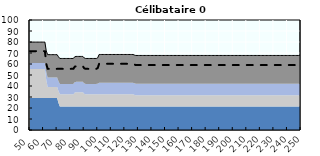
| Category | Coin fiscal marginal (somme des composantes) | Taux d’imposition marginal net |
|---|---|---|
| 50.0 | 79.927 | 71.687 |
| 51.0 | 79.927 | 71.687 |
| 52.0 | 79.927 | 71.687 |
| 53.0 | 79.927 | 71.687 |
| 54.0 | 79.927 | 71.687 |
| 55.0 | 79.927 | 71.687 |
| 56.0 | 79.927 | 71.687 |
| 57.0 | 79.927 | 71.687 |
| 58.0 | 79.927 | 71.687 |
| 59.0 | 79.927 | 71.687 |
| 60.0 | 79.927 | 71.687 |
| 61.0 | 79.927 | 71.687 |
| 62.0 | 71.871 | 60.325 |
| 63.0 | 68.504 | 55.575 |
| 64.0 | 68.504 | 55.575 |
| 65.0 | 68.504 | 55.575 |
| 66.0 | 68.504 | 55.575 |
| 67.0 | 68.504 | 55.575 |
| 68.0 | 68.504 | 55.575 |
| 69.0 | 68.504 | 55.575 |
| 70.0 | 68.504 | 55.575 |
| 71.0 | 66.593 | 55.575 |
| 72.0 | 65.033 | 55.575 |
| 73.0 | 65.033 | 55.575 |
| 74.0 | 65.033 | 55.575 |
| 75.0 | 65.033 | 55.575 |
| 76.0 | 65.033 | 55.575 |
| 77.0 | 65.033 | 55.575 |
| 78.0 | 65.033 | 55.575 |
| 79.0 | 65.033 | 55.575 |
| 80.0 | 65.033 | 55.575 |
| 81.0 | 65.033 | 55.575 |
| 82.0 | 65.033 | 55.575 |
| 83.0 | 66.568 | 57.526 |
| 84.0 | 66.887 | 57.93 |
| 85.0 | 66.887 | 57.93 |
| 86.0 | 66.887 | 57.93 |
| 87.0 | 66.887 | 57.93 |
| 88.0 | 66.887 | 57.93 |
| 89.0 | 66.887 | 57.93 |
| 90.0 | 65.516 | 56.188 |
| 91.0 | 65.033 | 55.575 |
| 92.0 | 65.033 | 55.575 |
| 93.0 | 65.033 | 55.575 |
| 94.0 | 65.033 | 55.575 |
| 95.0 | 65.033 | 55.575 |
| 96.0 | 65.033 | 55.575 |
| 97.0 | 65.033 | 55.575 |
| 98.0 | 65.033 | 55.575 |
| 99.0 | 65.033 | 55.575 |
| 100.0 | 65.679 | 56.396 |
| 101.0 | 68.651 | 60.172 |
| 102.0 | 68.651 | 60.172 |
| 103.0 | 68.651 | 60.172 |
| 104.0 | 68.651 | 60.172 |
| 105.0 | 68.651 | 60.172 |
| 106.0 | 68.651 | 60.172 |
| 107.0 | 68.651 | 60.172 |
| 108.0 | 68.651 | 60.172 |
| 109.0 | 68.651 | 60.172 |
| 110.0 | 68.651 | 60.172 |
| 111.0 | 68.651 | 60.172 |
| 112.0 | 68.651 | 60.172 |
| 113.0 | 68.651 | 60.172 |
| 114.0 | 68.651 | 60.172 |
| 115.0 | 68.651 | 60.172 |
| 116.0 | 68.651 | 60.172 |
| 117.0 | 68.651 | 60.172 |
| 118.0 | 68.651 | 60.172 |
| 119.0 | 68.651 | 60.172 |
| 120.0 | 68.651 | 60.172 |
| 121.0 | 68.651 | 60.172 |
| 122.0 | 68.651 | 60.172 |
| 123.0 | 68.651 | 60.172 |
| 124.0 | 68.651 | 60.172 |
| 125.0 | 68.651 | 60.172 |
| 126.0 | 68.651 | 60.172 |
| 127.0 | 68.159 | 59.547 |
| 128.0 | 67.762 | 59.042 |
| 129.0 | 67.762 | 59.042 |
| 130.0 | 67.762 | 59.042 |
| 131.0 | 67.762 | 59.042 |
| 132.0 | 67.762 | 59.042 |
| 133.0 | 67.762 | 59.042 |
| 134.0 | 67.762 | 59.042 |
| 135.0 | 67.762 | 59.042 |
| 136.0 | 67.762 | 59.042 |
| 137.0 | 67.762 | 59.042 |
| 138.0 | 67.762 | 59.042 |
| 139.0 | 67.762 | 59.042 |
| 140.0 | 67.762 | 59.042 |
| 141.0 | 67.762 | 59.042 |
| 142.0 | 67.762 | 59.042 |
| 143.0 | 67.762 | 59.042 |
| 144.0 | 67.762 | 59.042 |
| 145.0 | 67.762 | 59.042 |
| 146.0 | 67.762 | 59.042 |
| 147.0 | 67.762 | 59.042 |
| 148.0 | 67.762 | 59.042 |
| 149.0 | 67.762 | 59.042 |
| 150.0 | 67.762 | 59.042 |
| 151.0 | 67.762 | 59.042 |
| 152.0 | 67.762 | 59.042 |
| 153.0 | 67.762 | 59.042 |
| 154.0 | 67.762 | 59.042 |
| 155.0 | 67.762 | 59.042 |
| 156.0 | 67.762 | 59.042 |
| 157.0 | 67.762 | 59.042 |
| 158.0 | 67.762 | 59.042 |
| 159.0 | 67.762 | 59.042 |
| 160.0 | 67.762 | 59.042 |
| 161.0 | 67.762 | 59.042 |
| 162.0 | 67.762 | 59.042 |
| 163.0 | 67.762 | 59.042 |
| 164.0 | 67.762 | 59.042 |
| 165.0 | 67.762 | 59.042 |
| 166.0 | 67.762 | 59.042 |
| 167.0 | 67.762 | 59.042 |
| 168.0 | 67.762 | 59.042 |
| 169.0 | 67.762 | 59.042 |
| 170.0 | 67.762 | 59.042 |
| 171.0 | 67.762 | 59.042 |
| 172.0 | 67.762 | 59.042 |
| 173.0 | 67.762 | 59.042 |
| 174.0 | 67.762 | 59.042 |
| 175.0 | 67.762 | 59.042 |
| 176.0 | 67.762 | 59.042 |
| 177.0 | 67.762 | 59.042 |
| 178.0 | 67.762 | 59.042 |
| 179.0 | 67.762 | 59.042 |
| 180.0 | 67.762 | 59.042 |
| 181.0 | 67.762 | 59.042 |
| 182.0 | 67.762 | 59.042 |
| 183.0 | 67.762 | 59.042 |
| 184.0 | 67.762 | 59.042 |
| 185.0 | 67.762 | 59.042 |
| 186.0 | 67.762 | 59.042 |
| 187.0 | 67.762 | 59.042 |
| 188.0 | 67.762 | 59.042 |
| 189.0 | 67.762 | 59.042 |
| 190.0 | 67.762 | 59.042 |
| 191.0 | 67.762 | 59.042 |
| 192.0 | 67.762 | 59.042 |
| 193.0 | 67.762 | 59.042 |
| 194.0 | 67.762 | 59.042 |
| 195.0 | 67.762 | 59.042 |
| 196.0 | 67.762 | 59.042 |
| 197.0 | 67.762 | 59.042 |
| 198.0 | 67.762 | 59.042 |
| 199.0 | 67.762 | 59.042 |
| 200.0 | 67.762 | 59.042 |
| 201.0 | 67.762 | 59.042 |
| 202.0 | 67.762 | 59.042 |
| 203.0 | 67.762 | 59.042 |
| 204.0 | 67.762 | 59.042 |
| 205.0 | 67.762 | 59.042 |
| 206.0 | 67.762 | 59.042 |
| 207.0 | 67.762 | 59.042 |
| 208.0 | 67.762 | 59.042 |
| 209.0 | 67.762 | 59.042 |
| 210.0 | 67.762 | 59.042 |
| 211.0 | 67.762 | 59.042 |
| 212.0 | 67.762 | 59.042 |
| 213.0 | 67.762 | 59.042 |
| 214.0 | 67.762 | 59.042 |
| 215.0 | 67.762 | 59.042 |
| 216.0 | 67.762 | 59.042 |
| 217.0 | 67.762 | 59.042 |
| 218.0 | 67.762 | 59.042 |
| 219.0 | 67.762 | 59.042 |
| 220.0 | 67.762 | 59.042 |
| 221.0 | 67.762 | 59.042 |
| 222.0 | 67.762 | 59.042 |
| 223.0 | 67.762 | 59.042 |
| 224.0 | 67.762 | 59.042 |
| 225.0 | 67.762 | 59.042 |
| 226.0 | 67.762 | 59.042 |
| 227.0 | 67.762 | 59.042 |
| 228.0 | 67.762 | 59.042 |
| 229.0 | 67.762 | 59.042 |
| 230.0 | 67.762 | 59.042 |
| 231.0 | 67.762 | 59.042 |
| 232.0 | 67.762 | 59.042 |
| 233.0 | 67.762 | 59.042 |
| 234.0 | 67.762 | 59.042 |
| 235.0 | 67.762 | 59.042 |
| 236.0 | 67.762 | 59.042 |
| 237.0 | 67.762 | 59.042 |
| 238.0 | 67.762 | 59.042 |
| 239.0 | 67.762 | 59.042 |
| 240.0 | 67.762 | 59.042 |
| 241.0 | 67.762 | 59.042 |
| 242.0 | 67.762 | 59.042 |
| 243.0 | 67.762 | 59.042 |
| 244.0 | 67.762 | 59.042 |
| 245.0 | 67.762 | 59.042 |
| 246.0 | 67.762 | 59.042 |
| 247.0 | 67.762 | 59.042 |
| 248.0 | 67.762 | 59.042 |
| 249.0 | 67.762 | 59.042 |
| 250.0 | 67.762 | 59.042 |